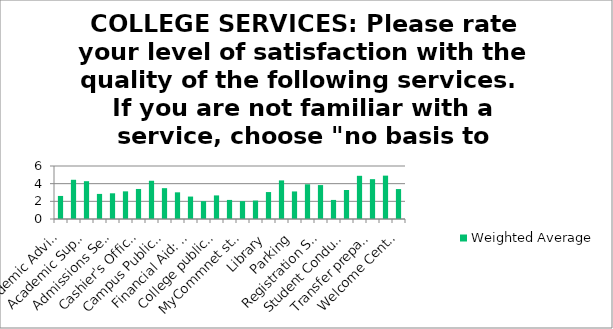
| Category | Weighted Average |
|---|---|
| Academic Advising Services | 2.61 |
| Academic Support: Disability Support Services | 4.44 |
| Academic Support: Tutoring Services | 4.28 |
| Academic Support: Services as a whole | 2.84 |
| Admissions Services | 2.91 |
| Bookstore | 3.13 |
| Cashier's Office: Tuition payment procedures | 3.4 |
| Career Services | 4.33 |
| Campus Public Safety | 3.49 |
| Financial Aid: Advising services | 3.02 |
| Financial Aid: Awards received | 2.54 |
| College email account | 2.02 |
| College publications (schedule of classes, student handbook, college catalog) | 2.67 |
| College website | 2.16 |
| MyCommnet student portal | 2.02 |
| College Blackboard | 2.09 |
| Library | 3.05 |
| New Student Orientation | 4.37 |
| Parking | 3.12 |
| Quality of open access computers and Printing | 3.93 |
| Registration Services: In person | 3.84 |
| Registration Services : Online | 2.16 |
| Student Conduct Office (interactions with faculty and staff | 3.28 |
| Student Life Office | 4.89 |
| Transfer preparation (e.g. fairs, panels and events) | 4.51 |
| Veteran and Military Community | 4.91 |
| Welcome Center | 3.39 |